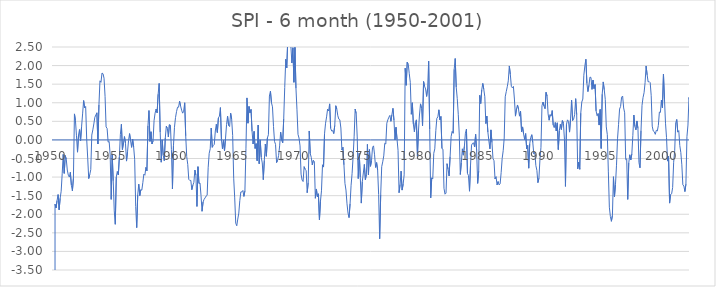
| Category | SPI - 4 month |
|---|---|
| 1950.0 | -99 |
| nan | -99 |
| nan | -1.73 |
| nan | -1.83 |
| nan | -1.63 |
| nan | -1.47 |
| nan | -1.88 |
| nan | -1.57 |
| nan | -1.38 |
| nan | -0.91 |
| nan | -0.39 |
| nan | -0.9 |
| nan | -0.42 |
| nan | -0.52 |
| nan | -0.81 |
| nan | -0.95 |
| nan | -1 |
| nan | -0.87 |
| nan | -1.22 |
| nan | -1.37 |
| nan | -1.03 |
| nan | 0.7 |
| nan | 0.52 |
| nan | 0.11 |
| nan | -0.33 |
| nan | 0.13 |
| nan | 0.28 |
| nan | -0.02 |
| nan | 0.36 |
| nan | 0.7 |
| nan | 1.06 |
| nan | 0.86 |
| nan | 0.9 |
| nan | 0.02 |
| nan | -0.49 |
| nan | -1.04 |
| nan | -0.93 |
| nan | -0.8 |
| nan | 0.13 |
| nan | 0.27 |
| nan | 0.43 |
| nan | 0.61 |
| nan | 0.67 |
| nan | 0.73 |
| nan | -0.11 |
| nan | 0.94 |
| nan | 1.59 |
| nan | 1.55 |
| nan | 1.8 |
| nan | 1.78 |
| nan | 1.66 |
| nan | 1.17 |
| nan | 0.35 |
| nan | 0.31 |
| nan | -0.06 |
| nan | -0.04 |
| nan | -0.4 |
| nan | -1.6 |
| 1955.0 | -0.39 |
| nan | -1.1 |
| nan | -1.91 |
| nan | -2.27 |
| nan | -1 |
| nan | -0.85 |
| nan | -0.94 |
| nan | -0.46 |
| nan | 0.15 |
| nan | 0.42 |
| nan | -0.26 |
| nan | -0.08 |
| nan | 0.09 |
| nan | -0.09 |
| nan | -0.57 |
| nan | -0.32 |
| nan | -0.02 |
| nan | 0.17 |
| nan | -0.02 |
| nan | -0.2 |
| nan | 0.02 |
| nan | -0.19 |
| nan | -0.52 |
| nan | -1.79 |
| nan | -2.36 |
| nan | -1.48 |
| nan | -1.19 |
| nan | -1.5 |
| nan | -1.34 |
| nan | -1.35 |
| nan | -1.15 |
| nan | -0.92 |
| nan | -0.95 |
| nan | -0.74 |
| nan | -0.83 |
| nan | 0.38 |
| nan | 0.79 |
| nan | -0.04 |
| nan | 0.22 |
| nan | -0.11 |
| nan | -0.03 |
| nan | 0.52 |
| nan | 0.72 |
| nan | 0.83 |
| nan | 0.73 |
| nan | 1.23 |
| nan | 1.52 |
| nan | 0.21 |
| nan | -0.6 |
| nan | 0 |
| nan | -0.42 |
| nan | -0.56 |
| nan | 0.05 |
| nan | 0.37 |
| nan | 0.31 |
| nan | 0.08 |
| nan | 0.41 |
| nan | 0.4 |
| nan | -0.26 |
| nan | -1.32 |
| 1960.0 | -0.16 |
| nan | 0.34 |
| nan | 0.6 |
| nan | 0.76 |
| nan | 0.88 |
| nan | 0.88 |
| nan | 1.04 |
| nan | 0.91 |
| nan | 0.8 |
| nan | 0.72 |
| nan | 0.77 |
| nan | 1 |
| nan | 0.11 |
| nan | -0.45 |
| nan | -0.66 |
| nan | -1.06 |
| nan | -1.09 |
| nan | -1.09 |
| nan | -1.34 |
| nan | -1.22 |
| nan | -1.14 |
| nan | -0.81 |
| nan | -0.95 |
| nan | -1.79 |
| nan | -0.72 |
| nan | -1.17 |
| nan | -1.16 |
| nan | -1.5 |
| nan | -1.92 |
| nan | -1.67 |
| nan | -1.6 |
| nan | -1.56 |
| nan | -1.51 |
| nan | -1.49 |
| nan | -0.75 |
| nan | -0.36 |
| nan | -0.24 |
| nan | 0.32 |
| nan | -0.2 |
| nan | -0.15 |
| nan | -0.12 |
| nan | 0.24 |
| nan | 0.42 |
| nan | 0.2 |
| nan | 0.59 |
| nan | 0.64 |
| nan | 0.87 |
| nan | 0.01 |
| nan | -0.24 |
| nan | -0.01 |
| nan | -0.29 |
| nan | 0.04 |
| nan | 0.41 |
| nan | 0.64 |
| nan | 0.39 |
| nan | 0.36 |
| nan | 0.72 |
| nan | 0.56 |
| nan | 0.12 |
| nan | -1.03 |
| 1965.0 | -1.56 |
| nan | -2.24 |
| nan | -2.31 |
| nan | -2.13 |
| nan | -1.97 |
| nan | -1.63 |
| nan | -1.4 |
| nan | -1.4 |
| nan | -1.36 |
| nan | -1.52 |
| nan | -1.37 |
| nan | -0.24 |
| nan | 1.13 |
| nan | 0.45 |
| nan | 0.9 |
| nan | 0.73 |
| nan | 0.82 |
| nan | 0.23 |
| nan | -0.11 |
| nan | 0.23 |
| nan | -0.23 |
| nan | -0.1 |
| nan | -0.56 |
| nan | 0.4 |
| nan | -0.64 |
| nan | 0 |
| nan | -0.47 |
| nan | -0.62 |
| nan | -1.07 |
| nan | -0.55 |
| nan | -0.11 |
| nan | -0.44 |
| nan | 0.05 |
| nan | 0.14 |
| nan | 1.18 |
| nan | 1.31 |
| nan | 1 |
| nan | 0.89 |
| nan | 0.36 |
| nan | -0.04 |
| nan | -0.12 |
| nan | -0.61 |
| nan | -0.55 |
| nan | -0.42 |
| nan | -0.16 |
| nan | 0.21 |
| nan | -0.01 |
| nan | -0.08 |
| nan | 0.57 |
| nan | 1.41 |
| nan | 2.17 |
| nan | 1.94 |
| nan | 2.74 |
| nan | 2.57 |
| nan | 2.69 |
| nan | 2.53 |
| nan | 2.07 |
| nan | 2.48 |
| nan | 1.55 |
| nan | 2.49 |
| 1970.0 | 1.39 |
| nan | 0.81 |
| nan | 0.15 |
| nan | 0.05 |
| nan | -0.16 |
| nan | -0.92 |
| nan | -1.08 |
| nan | -1.12 |
| nan | -0.72 |
| nan | -0.79 |
| nan | -0.83 |
| nan | -1.42 |
| nan | -1.15 |
| nan | 0.24 |
| nan | -0.37 |
| nan | -0.47 |
| nan | -0.67 |
| nan | -0.55 |
| nan | -0.58 |
| nan | -1.57 |
| nan | -1.32 |
| nan | -1.53 |
| nan | -1.45 |
| nan | -2.15 |
| nan | -1.65 |
| nan | -1.37 |
| nan | -0.67 |
| nan | -0.73 |
| nan | 0.17 |
| nan | 0.45 |
| nan | 0.62 |
| nan | 0.83 |
| nan | 0.78 |
| nan | 0.97 |
| nan | 0.31 |
| nan | 0.24 |
| nan | 0.25 |
| nan | 0.17 |
| nan | 0.39 |
| nan | 0.92 |
| nan | 0.83 |
| nan | 0.65 |
| nan | 0.56 |
| nan | 0.54 |
| nan | 0.32 |
| nan | -0.27 |
| nan | -0.2 |
| nan | -0.67 |
| nan | -1.17 |
| nan | -1.35 |
| nan | -1.72 |
| nan | -1.97 |
| nan | -2.09 |
| nan | -1.72 |
| nan | -1.22 |
| nan | -0.9 |
| nan | -0.44 |
| nan | 0.1 |
| nan | 0.83 |
| nan | 0.71 |
| 1975.0 | 0.08 |
| nan | -1.04 |
| nan | -0.36 |
| nan | -1 |
| nan | -1.7 |
| nan | -1.12 |
| nan | -0.89 |
| nan | -0.66 |
| nan | -1.07 |
| nan | -0.93 |
| nan | -0.12 |
| nan | -0.94 |
| nan | -0.26 |
| nan | -0.71 |
| nan | -0.56 |
| nan | -0.2 |
| nan | -0.16 |
| nan | -0.4 |
| nan | -0.74 |
| nan | -0.61 |
| nan | -0.81 |
| nan | -1.47 |
| nan | -2.66 |
| nan | -1.47 |
| nan | -0.72 |
| nan | -0.59 |
| nan | -0.43 |
| nan | -0.09 |
| nan | -0.11 |
| nan | 0.45 |
| nan | 0.54 |
| nan | 0.61 |
| nan | 0.66 |
| nan | 0.5 |
| nan | 0.68 |
| nan | 0.85 |
| nan | 0.53 |
| nan | 0 |
| nan | 0.34 |
| nan | 0.02 |
| nan | -0.28 |
| nan | -1.42 |
| nan | -1.2 |
| nan | -0.84 |
| nan | -1.35 |
| nan | -1.19 |
| nan | -0.94 |
| nan | 1.93 |
| nan | 1.47 |
| nan | 2.09 |
| nan | 2.03 |
| nan | 1.78 |
| nan | 1.55 |
| nan | 0.69 |
| nan | 1 |
| nan | 0.43 |
| nan | 0.22 |
| nan | 0.47 |
| nan | 0.54 |
| nan | -0.44 |
| 1980.0 | 0.24 |
| nan | 0.67 |
| nan | 0.97 |
| nan | 0.85 |
| nan | 0.38 |
| nan | 1.57 |
| nan | 1.44 |
| nan | 1.37 |
| nan | 1.17 |
| nan | 1.39 |
| nan | 2.12 |
| nan | 0.29 |
| nan | -1.56 |
| nan | -1.02 |
| nan | -1.05 |
| nan | -0.36 |
| nan | -0.24 |
| nan | 0.25 |
| nan | 0.58 |
| nan | 0.62 |
| nan | 0.81 |
| nan | 0.54 |
| nan | 0.63 |
| nan | -0.23 |
| nan | -0.25 |
| nan | -1.3 |
| nan | -1.46 |
| nan | -1.43 |
| nan | -0.64 |
| nan | -0.79 |
| nan | -0.97 |
| nan | -0.45 |
| nan | 0.09 |
| nan | 0.23 |
| nan | 0.18 |
| nan | 1.9 |
| nan | 2.19 |
| nan | 1.42 |
| nan | 1.11 |
| nan | 0.69 |
| nan | 0.13 |
| nan | -0.93 |
| nan | -0.61 |
| nan | -0.24 |
| nan | -0.41 |
| nan | -0.17 |
| nan | 0.18 |
| nan | 0.29 |
| nan | -0.9 |
| nan | -0.96 |
| nan | -1.38 |
| nan | -0.68 |
| nan | -0.14 |
| nan | -0.09 |
| nan | -0.08 |
| nan | -0.19 |
| nan | 0.15 |
| nan | -0.29 |
| nan | -1.17 |
| nan | -0.84 |
| 1985.0 | 1.2 |
| nan | 0.98 |
| nan | 1.35 |
| nan | 1.52 |
| nan | 1.36 |
| nan | 1.16 |
| nan | 0.44 |
| nan | 0.64 |
| nan | 0.21 |
| nan | -0.03 |
| nan | -0.24 |
| nan | 0.27 |
| nan | -0.07 |
| nan | -0.5 |
| nan | -0.56 |
| nan | -1.05 |
| nan | -0.99 |
| nan | -1.21 |
| nan | -1.12 |
| nan | -1.21 |
| nan | -1.18 |
| nan | -0.88 |
| nan | -0.5 |
| nan | -0.29 |
| nan | 0.05 |
| nan | 1.16 |
| nan | 1.3 |
| nan | 1.43 |
| nan | 1.59 |
| nan | 1.99 |
| nan | 1.76 |
| nan | 1.44 |
| nan | 1.4 |
| nan | 1.44 |
| nan | 1.1 |
| nan | 0.64 |
| nan | 0.83 |
| nan | 0.94 |
| nan | 0.83 |
| nan | 0.64 |
| nan | 0.77 |
| nan | 0.22 |
| nan | 0.35 |
| nan | 0.16 |
| nan | 0.01 |
| nan | 0.17 |
| nan | -0.24 |
| nan | -0.15 |
| nan | -0.76 |
| nan | -0.1 |
| nan | 0.07 |
| nan | 0.14 |
| nan | -0.07 |
| nan | -0.38 |
| nan | -0.33 |
| nan | -0.69 |
| nan | -0.82 |
| nan | -1.15 |
| nan | -1.03 |
| nan | -0.53 |
| 1990.0 | -0.2 |
| nan | 0.92 |
| nan | 1.02 |
| nan | 0.91 |
| nan | 0.84 |
| nan | 1.28 |
| nan | 1.18 |
| nan | 0.7 |
| nan | 0.53 |
| nan | 0.68 |
| nan | 0.64 |
| nan | 0.79 |
| nan | 0.4 |
| nan | 0.33 |
| nan | 0.47 |
| nan | 0.24 |
| nan | 0.46 |
| nan | -0.26 |
| nan | 0.25 |
| nan | 0.42 |
| nan | 0.28 |
| nan | 0.52 |
| nan | 0.45 |
| nan | 0.02 |
| nan | -1.25 |
| nan | 0.42 |
| nan | 0.54 |
| nan | 0.5 |
| nan | 0.21 |
| nan | 0.58 |
| nan | 1.07 |
| nan | 0.52 |
| nan | 0.56 |
| nan | 0.68 |
| nan | 1.11 |
| nan | 0.68 |
| nan | -0.78 |
| nan | -0.6 |
| nan | -0.79 |
| nan | 0.72 |
| nan | 1.02 |
| nan | 1.1 |
| nan | 1.74 |
| nan | 1.99 |
| nan | 2.17 |
| nan | 1.52 |
| nan | 1.3 |
| nan | 1.47 |
| nan | 1.69 |
| nan | 1.68 |
| nan | 1.36 |
| nan | 1.61 |
| nan | 1.38 |
| nan | 1.49 |
| nan | 0.78 |
| nan | 0.65 |
| nan | 0.71 |
| nan | 0.4 |
| nan | 0.82 |
| nan | -0.23 |
| 1995.0 | 1.23 |
| nan | 1.56 |
| nan | 1.35 |
| nan | 1.09 |
| nan | 0.35 |
| nan | 0.14 |
| nan | -0.84 |
| nan | -1.81 |
| nan | -2.06 |
| nan | -2.19 |
| nan | -2.03 |
| nan | -0.99 |
| nan | -1.53 |
| nan | -1.2 |
| nan | -0.68 |
| nan | 0.03 |
| nan | 0.41 |
| nan | 0.83 |
| nan | 0.9 |
| nan | 1.15 |
| nan | 1.18 |
| nan | 0.86 |
| nan | 0.73 |
| nan | -0.53 |
| nan | -0.51 |
| nan | -1.6 |
| nan | -0.62 |
| nan | -0.4 |
| nan | -0.54 |
| nan | -0.38 |
| nan | 0.12 |
| nan | 0.67 |
| nan | 0.36 |
| nan | 0.27 |
| nan | 0.51 |
| nan | 0.31 |
| nan | -0.61 |
| nan | -0.75 |
| nan | 0.25 |
| nan | 0.93 |
| nan | 1.14 |
| nan | 1.27 |
| nan | 1.54 |
| nan | 1.99 |
| nan | 1.75 |
| nan | 1.56 |
| nan | 1.57 |
| nan | 1.54 |
| nan | 1.19 |
| nan | 0.37 |
| nan | 0.24 |
| nan | 0.22 |
| nan | 0.15 |
| nan | 0.26 |
| nan | 0.24 |
| nan | 0.39 |
| nan | 0.75 |
| nan | 0.74 |
| nan | 1.07 |
| nan | 0.86 |
| 2000.0 | 1.77 |
| nan | 1.1 |
| nan | 0.45 |
| nan | 0.06 |
| nan | -0.57 |
| nan | -0.44 |
| nan | -1.7 |
| nan | -1.47 |
| nan | -1.45 |
| nan | -1.28 |
| nan | -0.6 |
| nan | -0.29 |
| nan | 0.46 |
| nan | 0.55 |
| nan | 0.21 |
| nan | 0.25 |
| nan | -0.15 |
| nan | -0.34 |
| nan | -0.67 |
| nan | -1.21 |
| nan | -1.24 |
| nan | -1.39 |
| nan | -1.19 |
| nan | 0.09 |
| nan | 0.4 |